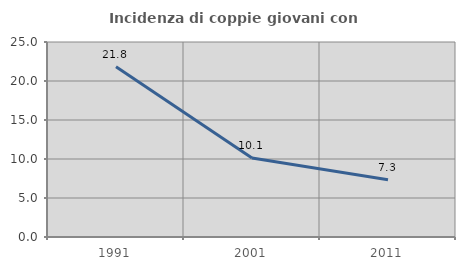
| Category | Incidenza di coppie giovani con figli |
|---|---|
| 1991.0 | 21.824 |
| 2001.0 | 10.132 |
| 2011.0 | 7.34 |